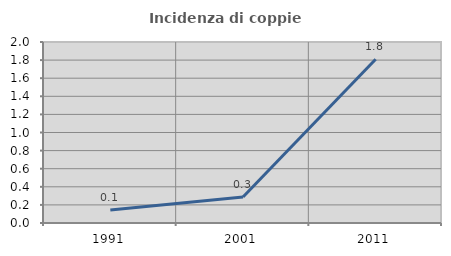
| Category | Incidenza di coppie miste |
|---|---|
| 1991.0 | 0.144 |
| 2001.0 | 0.287 |
| 2011.0 | 1.809 |